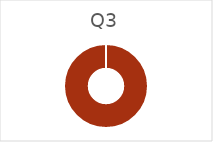
| Category | Q3 |
|---|---|
| 0 | 143440 |
| 1 | 0 |